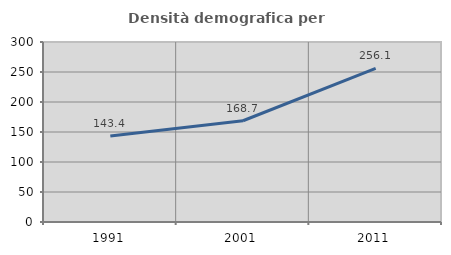
| Category | Densità demografica |
|---|---|
| 1991.0 | 143.404 |
| 2001.0 | 168.721 |
| 2011.0 | 256.131 |